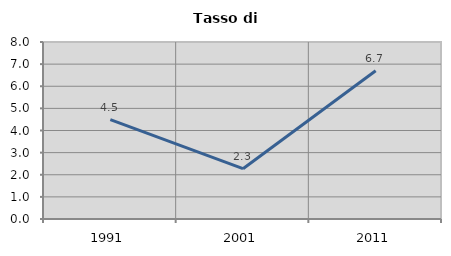
| Category | Tasso di disoccupazione   |
|---|---|
| 1991.0 | 4.494 |
| 2001.0 | 2.273 |
| 2011.0 | 6.699 |